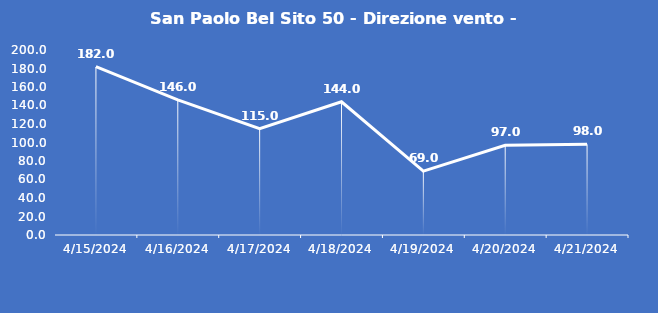
| Category | San Paolo Bel Sito 50 - Direzione vento - Grezzo (°N) |
|---|---|
| 4/15/24 | 182 |
| 4/16/24 | 146 |
| 4/17/24 | 115 |
| 4/18/24 | 144 |
| 4/19/24 | 69 |
| 4/20/24 | 97 |
| 4/21/24 | 98 |